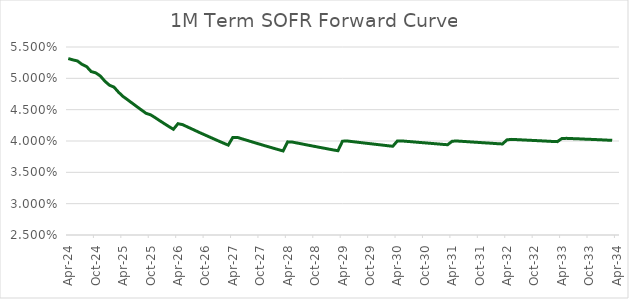
| Category | Series 0 |
|---|---|
| 2024-04-22 | 0.053 |
| 2024-05-22 | 0.053 |
| 2024-06-20 | 0.053 |
| 2024-07-22 | 0.052 |
| 2024-08-22 | 0.052 |
| 2024-09-20 | 0.051 |
| 2024-10-22 | 0.051 |
| 2024-11-21 | 0.05 |
| 2024-12-20 | 0.05 |
| 2025-01-22 | 0.049 |
| 2025-02-20 | 0.049 |
| 2025-03-20 | 0.048 |
| 2025-04-22 | 0.047 |
| 2025-05-22 | 0.047 |
| 2025-06-20 | 0.046 |
| 2025-07-22 | 0.045 |
| 2025-08-21 | 0.045 |
| 2025-09-22 | 0.044 |
| 2025-10-22 | 0.044 |
| 2025-11-20 | 0.044 |
| 2025-12-22 | 0.043 |
| 2026-01-22 | 0.043 |
| 2026-02-20 | 0.042 |
| 2026-03-20 | 0.042 |
| 2026-04-22 | 0.043 |
| 2026-05-21 | 0.043 |
| 2026-06-22 | 0.042 |
| 2026-07-22 | 0.042 |
| 2026-08-20 | 0.042 |
| 2026-09-22 | 0.041 |
| 2026-10-22 | 0.041 |
| 2026-11-20 | 0.041 |
| 2026-12-22 | 0.04 |
| 2027-01-21 | 0.04 |
| 2027-02-22 | 0.04 |
| 2027-03-22 | 0.039 |
| 2027-04-22 | 0.041 |
| 2027-05-20 | 0.041 |
| 2027-06-22 | 0.04 |
| 2027-07-22 | 0.04 |
| 2027-08-20 | 0.04 |
| 2027-09-22 | 0.04 |
| 2027-10-21 | 0.039 |
| 2027-11-22 | 0.039 |
| 2027-12-22 | 0.039 |
| 2028-01-20 | 0.039 |
| 2028-02-22 | 0.039 |
| 2028-03-22 | 0.038 |
| 2028-04-20 | 0.04 |
| 2028-05-22 | 0.04 |
| 2028-06-22 | 0.04 |
| 2028-07-20 | 0.04 |
| 2028-08-22 | 0.039 |
| 2028-09-21 | 0.039 |
| 2028-10-20 | 0.039 |
| 2028-11-21 | 0.039 |
| 2028-12-21 | 0.039 |
| 2029-01-22 | 0.039 |
| 2029-02-22 | 0.039 |
| 2029-03-22 | 0.038 |
| 2029-04-20 | 0.04 |
| 2029-05-22 | 0.04 |
| 2029-06-21 | 0.04 |
| 2029-07-20 | 0.04 |
| 2029-08-22 | 0.04 |
| 2029-09-20 | 0.04 |
| 2029-10-22 | 0.04 |
| 2029-11-21 | 0.039 |
| 2029-12-20 | 0.039 |
| 2030-01-22 | 0.039 |
| 2030-02-21 | 0.039 |
| 2030-03-21 | 0.039 |
| 2030-04-22 | 0.04 |
| 2030-05-22 | 0.04 |
| 2030-06-20 | 0.04 |
| 2030-07-22 | 0.04 |
| 2030-08-22 | 0.04 |
| 2030-09-20 | 0.04 |
| 2030-10-22 | 0.04 |
| 2030-11-21 | 0.04 |
| 2030-12-20 | 0.04 |
| 2031-01-22 | 0.04 |
| 2031-02-20 | 0.039 |
| 2031-03-20 | 0.039 |
| 2031-04-22 | 0.04 |
| 2031-05-22 | 0.04 |
| 2031-06-20 | 0.04 |
| 2031-07-22 | 0.04 |
| 2031-08-21 | 0.04 |
| 2031-09-22 | 0.04 |
| 2031-10-22 | 0.04 |
| 2031-11-20 | 0.04 |
| 2031-12-22 | 0.04 |
| 2032-01-22 | 0.04 |
| 2032-02-20 | 0.04 |
| 2032-03-22 | 0.04 |
| 2032-04-22 | 0.04 |
| 2032-05-20 | 0.04 |
| 2032-06-22 | 0.04 |
| 2032-07-22 | 0.04 |
| 2032-08-20 | 0.04 |
| 2032-09-22 | 0.04 |
| 2032-10-21 | 0.04 |
| 2032-11-22 | 0.04 |
| 2032-12-22 | 0.04 |
| 2033-01-20 | 0.04 |
| 2033-02-22 | 0.04 |
| 2033-03-22 | 0.04 |
| 2033-04-21 | 0.04 |
| 2033-05-20 | 0.04 |
| 2033-06-22 | 0.04 |
| 2033-07-21 | 0.04 |
| 2033-08-22 | 0.04 |
| 2033-09-22 | 0.04 |
| 2033-10-20 | 0.04 |
| 2033-11-22 | 0.04 |
| 2033-12-22 | 0.04 |
| 2034-01-20 | 0.04 |
| 2034-02-22 | 0.04 |
| 2034-03-22 | 0.04 |